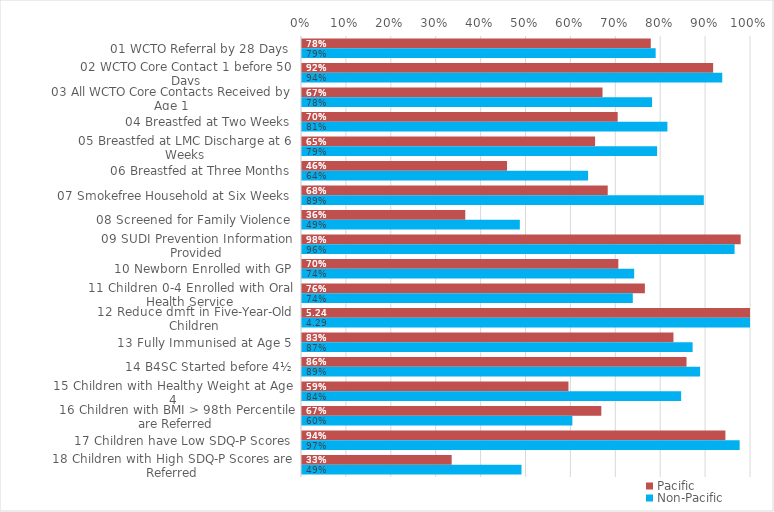
| Category | Pacific | Non-Pacific |
|---|---|---|
| 01 WCTO Referral by 28 Days | 0.777 | 0.788 |
| 02 WCTO Core Contact 1 before 50 Days | 0.916 | 0.936 |
| 03 All WCTO Core Contacts Received by Age 1 | 0.669 | 0.78 |
| 04 Breastfed at Two Weeks | 0.703 | 0.814 |
| 05 Breastfed at LMC Discharge at 6 Weeks | 0.653 | 0.791 |
| 06 Breastfed at Three Months | 0.457 | 0.637 |
| 07 Smokefree Household at Six Weeks | 0.681 | 0.895 |
| 08 Screened for Family Violence | 0.364 | 0.485 |
| 09 SUDI Prevention Information Provided | 0.977 | 0.963 |
| 10 Newborn Enrolled with GP | 0.705 | 0.74 |
| 11 Children 0-4 Enrolled with Oral Health Service | 0.764 | 0.737 |
| 12 Reduce dmft in Five-Year-Old Children | 5.241 | 4.291 |
| 13 Fully Immunised at Age 5 | 0.827 | 0.87 |
| 14 B4SC Started before 4½ | 0.856 | 0.887 |
| 15 Children with Healthy Weight at Age 4 | 0.593 | 0.844 |
| 16 Children with BMI > 98th Percentile are Referred | 0.667 | 0.602 |
| 17 Children have Low SDQ-P Scores | 0.943 | 0.975 |
| 18 Children with High SDQ-P Scores are Referred | 0.333 | 0.489 |